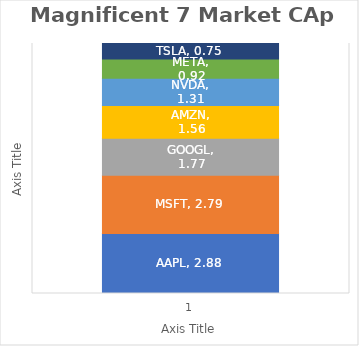
| Category | AAPL | MSFT | GOOGL | AMZN | NVDA | META | TSLA |
|---|---|---|---|---|---|---|---|
| 0 | 2.879 | 2.793 | 1.773 | 1.564 | 1.313 | 0.919 | 0.747 |